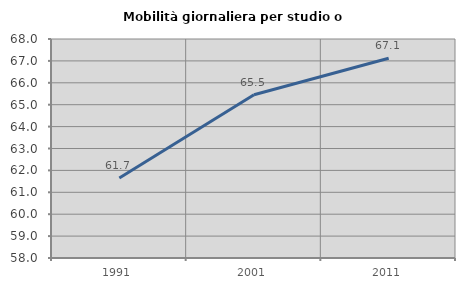
| Category | Mobilità giornaliera per studio o lavoro |
|---|---|
| 1991.0 | 61.653 |
| 2001.0 | 65.453 |
| 2011.0 | 67.123 |